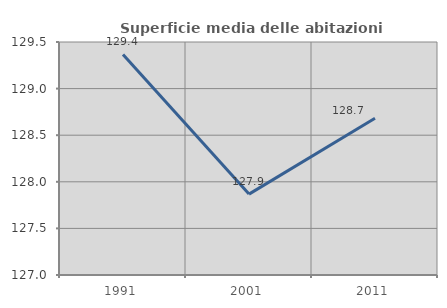
| Category | Superficie media delle abitazioni occupate |
|---|---|
| 1991.0 | 129.367 |
| 2001.0 | 127.868 |
| 2011.0 | 128.681 |